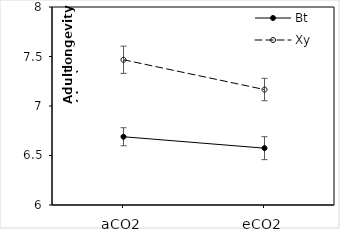
| Category | Bt | Xy |
|---|---|---|
| aCO2 | 6.689 | 7.467 |
| eCO2 | 6.574 | 7.166 |